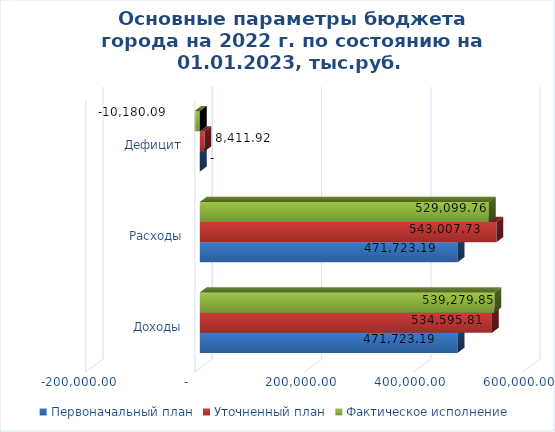
| Category | Первоначальный план | Уточненный план | Фактическое исполнение |
|---|---|---|---|
| Доходы | 471723.19 | 534595.81 | 539279.85 |
| Расходы | 471723.19 | 543007.73 | 529099.76 |
| Дефицит | 0 | 8411.92 | -10180.09 |